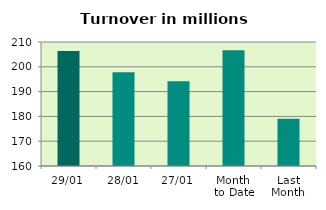
| Category | Series 0 |
|---|---|
| 29/01 | 206.394 |
| 28/01 | 197.759 |
| 27/01 | 194.143 |
| Month 
to Date | 206.655 |
| Last
Month | 179.047 |